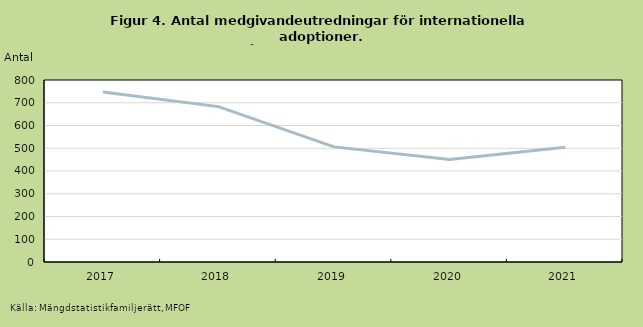
| Category | Medgivandeutredningar |
|---|---|
| 2017.0 | 747 |
| 2018.0 | 683 |
| 2019.0 | 506 |
| 2020.0 | 451 |
| 2021.0 | 504 |